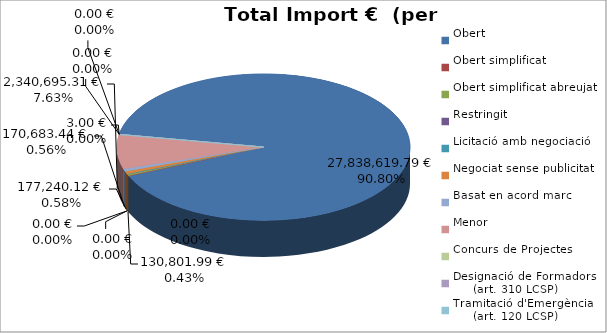
| Category | Total preu
(amb IVA) |
|---|---|
| Obert | 27838619.79 |
| Obert simplificat | 0 |
| Obert simplificat abreujat | 130801.995 |
| Restringit | 0 |
| Licitació amb negociació | 0 |
| Negociat sense publicitat | 177240.122 |
| Basat en acord marc | 170683.439 |
| Menor | 2340695.306 |
| Concurs de Projectes | 3 |
| Designació de Formadors
     (art. 310 LCSP) | 0 |
| Tramitació d'Emergència
     (art. 120 LCSP) | 0 |